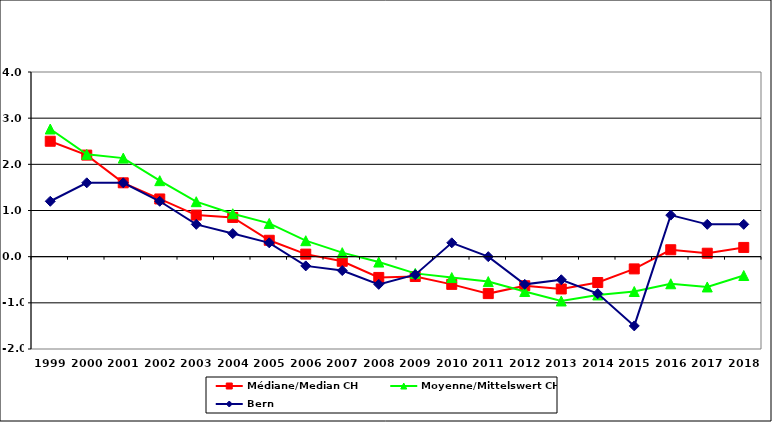
| Category | Médiane/Median CH | Moyenne/Mittelswert CH | Bern |
|---|---|---|---|
| 1999.0 | 2.5 | 2.765 | 1.2 |
| 2000.0 | 2.2 | 2.216 | 1.6 |
| 2001.0 | 1.6 | 2.135 | 1.6 |
| 2002.0 | 1.25 | 1.646 | 1.2 |
| 2003.0 | 0.9 | 1.191 | 0.7 |
| 2004.0 | 0.85 | 0.93 | 0.5 |
| 2005.0 | 0.355 | 0.72 | 0.3 |
| 2006.0 | 0.055 | 0.346 | -0.2 |
| 2007.0 | -0.1 | 0.087 | -0.3 |
| 2008.0 | -0.45 | -0.117 | -0.6 |
| 2009.0 | -0.43 | -0.362 | -0.39 |
| 2010.0 | -0.6 | -0.453 | 0.3 |
| 2011.0 | -0.8 | -0.54 | 0 |
| 2012.0 | -0.63 | -0.754 | -0.6 |
| 2013.0 | -0.7 | -0.96 | -0.5 |
| 2014.0 | -0.56 | -0.829 | -0.8 |
| 2015.0 | -0.265 | -0.755 | -1.5 |
| 2016.0 | 0.15 | -0.587 | 0.9 |
| 2017.0 | 0.075 | -0.656 | 0.7 |
| 2018.0 | 0.2 | -0.408 | 0.7 |